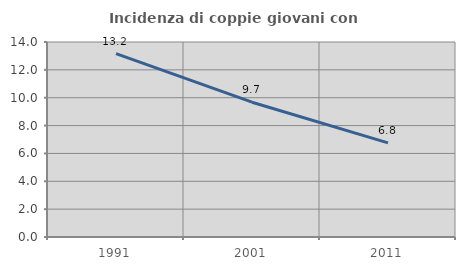
| Category | Incidenza di coppie giovani con figli |
|---|---|
| 1991.0 | 13.162 |
| 2001.0 | 9.677 |
| 2011.0 | 6.757 |